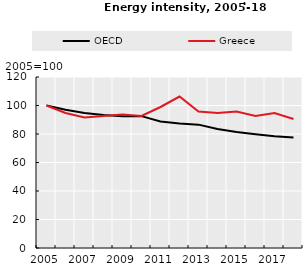
| Category | OECD | Greece |
|---|---|---|
| 2005.0 | 100 | 100 |
| 2006.0 | 97.015 | 94.737 |
| 2007.0 | 94.776 | 91.579 |
| 2008.0 | 93.284 | 92.632 |
| 2009.0 | 92.537 | 93.684 |
| 2010.0 | 92.537 | 92.632 |
| 2011.0 | 88.806 | 98.947 |
| 2012.0 | 87.313 | 106.316 |
| 2013.0 | 86.567 | 95.789 |
| 2014.0 | 83.582 | 94.737 |
| 2015.0 | 81.343 | 95.789 |
| 2016.0 | 79.851 | 92.632 |
| 2017.0 | 78.358 | 94.737 |
| 2018.0 | 77.612 | 90.526 |